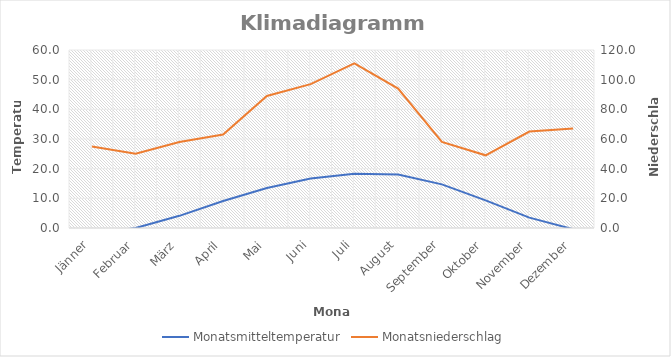
| Category | Monatsmitteltemperatur |
|---|---|
| Jänner | -2 |
| Februar | 0 |
| März | 4.1 |
| April | 9.1 |
| Mai | 13.5 |
| Juni | 16.7 |
| Juli | 18.3 |
| August | 18 |
| September | 14.7 |
| Oktober | 9.3 |
| November | 3.5 |
| Dezember | -0.4 |